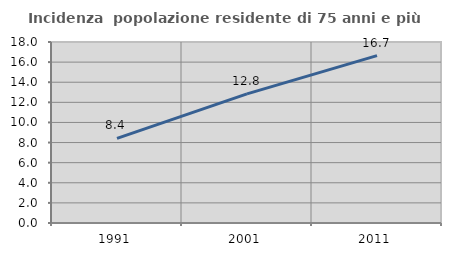
| Category | Incidenza  popolazione residente di 75 anni e più |
|---|---|
| 1991.0 | 8.408 |
| 2001.0 | 12.841 |
| 2011.0 | 16.651 |